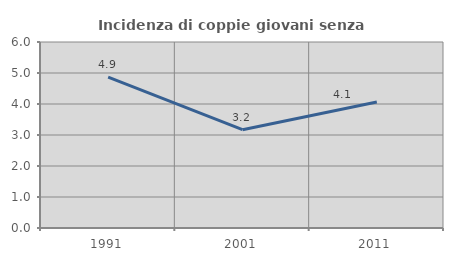
| Category | Incidenza di coppie giovani senza figli |
|---|---|
| 1991.0 | 4.87 |
| 2001.0 | 3.172 |
| 2011.0 | 4.065 |